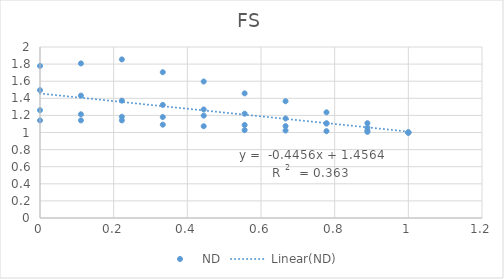
| Category | ND |
|---|---|
| 1.0 | 1 |
| 0.888888 | 1.008 |
| 0.777776 | 1.016 |
| 0.6666640000000001 | 1.023 |
| 0.5555520000000002 | 1.028 |
| 0.44444000000000017 | 1.073 |
| 0.3333280000000002 | 1.092 |
| 0.2222160000000002 | 1.142 |
| 0.1111040000000002 | 1.142 |
| 0.0 | 1.141 |
| 1.0 | 1 |
| 0.8888888888888888 | 1.109 |
| 0.7777777777777778 | 1.236 |
| 0.6666666666666666 | 1.366 |
| 0.5555555555555556 | 1.458 |
| 0.4444444444444444 | 1.596 |
| 0.3333333333333333 | 1.705 |
| 0.2222222222222222 | 1.855 |
| 0.1111111111111111 | 1.808 |
| 0.0 | 1.779 |
| 1.0 | 1 |
| 0.888888888888889 | 1.058 |
| 0.7777777777777779 | 1.106 |
| 0.6666666666666667 | 1.164 |
| 0.5555555555555557 | 1.22 |
| 0.44444444444444464 | 1.269 |
| 0.33333333333333354 | 1.323 |
| 0.22222222222222238 | 1.372 |
| 0.11111111111111119 | 1.432 |
| 0.0 | 1.495 |
| 1.0 | 1 |
| 0.8888889411764708 | 1.022 |
| 0.7777778823529415 | 1.107 |
| 0.6666668235294123 | 1.075 |
| 0.555555764705883 | 1.088 |
| 0.44444470588235374 | 1.197 |
| 0.3333336470588245 | 1.181 |
| 0.22222258823529528 | 1.184 |
| 0.11111152941176602 | 1.213 |
| 0.0 | 1.261 |